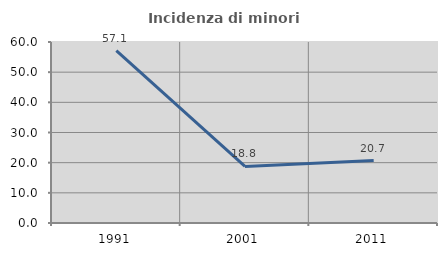
| Category | Incidenza di minori stranieri |
|---|---|
| 1991.0 | 57.143 |
| 2001.0 | 18.75 |
| 2011.0 | 20.69 |